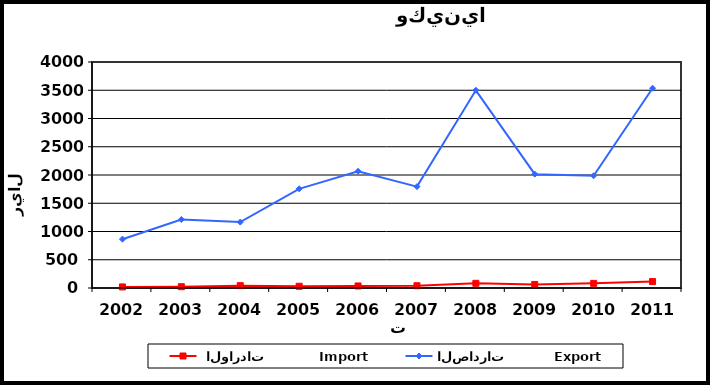
| Category |  الواردات           Import | الصادرات          Export |
|---|---|---|
| 2002.0 | 19 | 864 |
| 2003.0 | 23 | 1212 |
| 2004.0 | 42 | 1167 |
| 2005.0 | 31 | 1755 |
| 2006.0 | 36 | 2066 |
| 2007.0 | 40 | 1794 |
| 2008.0 | 83 | 3499 |
| 2009.0 | 63 | 2015 |
| 2010.0 | 82 | 1987 |
| 2011.0 | 114 | 3536 |